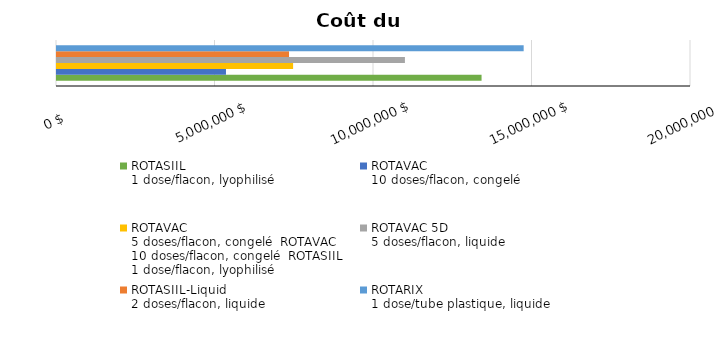
| Category | ROTASIIL
1 dose/flacon, lyophilisé | ROTAVAC
10 doses/flacon, congelé | ROTAVAC
5 doses/flacon, congelé ROTAVAC
10 doses/flacon, congelé ROTASIIL
1 dose/flacon, lyophilisé | ROTAVAC 5D
5 doses/flacon, liquide | ROTASIIL-Liquid
2 doses/flacon, liquide | ROTARIX
1 dose/tube plastique, liquide |
|---|---|---|---|---|---|---|
| Total
pour 5 ans | 13393255.948 | 5330463.885 | 7448301.518 | 10975585.981 | 7319334.871 | 14721365.579 |